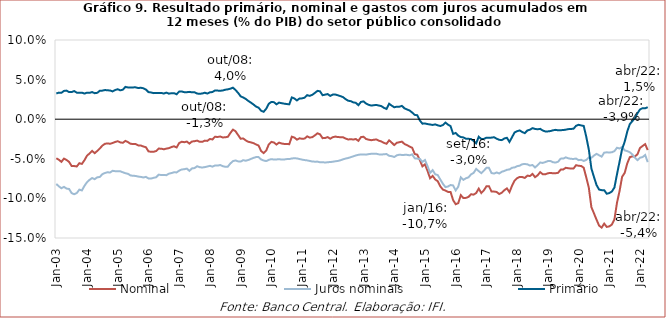
| Category | Nominal | Juros nominais | Primário |
|---|---|---|---|
| 2003-01-01 | -0.049 | -0.082 | 0.032 |
| 2003-02-01 | -0.051 | -0.085 | 0.034 |
| 2003-03-01 | -0.054 | -0.087 | 0.033 |
| 2003-04-01 | -0.05 | -0.085 | 0.036 |
| 2003-05-01 | -0.051 | -0.088 | 0.036 |
| 2003-06-01 | -0.054 | -0.088 | 0.034 |
| 2003-07-01 | -0.059 | -0.093 | 0.034 |
| 2003-08-01 | -0.059 | -0.095 | 0.036 |
| 2003-09-01 | -0.06 | -0.093 | 0.034 |
| 2003-10-01 | -0.056 | -0.089 | 0.033 |
| 2003-11-01 | -0.056 | -0.09 | 0.034 |
| 2003-12-01 | -0.052 | -0.084 | 0.032 |
| 2004-01-01 | -0.046 | -0.08 | 0.033 |
| 2004-02-01 | -0.043 | -0.077 | 0.033 |
| 2004-03-01 | -0.04 | -0.074 | 0.034 |
| 2004-04-01 | -0.043 | -0.076 | 0.033 |
| 2004-05-01 | -0.04 | -0.073 | 0.033 |
| 2004-06-01 | -0.037 | -0.073 | 0.036 |
| 2004-07-01 | -0.033 | -0.069 | 0.036 |
| 2004-08-01 | -0.031 | -0.068 | 0.037 |
| 2004-09-01 | -0.031 | -0.067 | 0.036 |
| 2004-10-01 | -0.031 | -0.067 | 0.036 |
| 2004-11-01 | -0.03 | -0.065 | 0.035 |
| 2004-12-01 | -0.029 | -0.066 | 0.037 |
| 2005-01-01 | -0.028 | -0.066 | 0.038 |
| 2005-02-01 | -0.029 | -0.066 | 0.036 |
| 2005-03-01 | -0.03 | -0.067 | 0.037 |
| 2005-04-01 | -0.027 | -0.068 | 0.041 |
| 2005-05-01 | -0.029 | -0.069 | 0.04 |
| 2005-06-01 | -0.031 | -0.071 | 0.04 |
| 2005-07-01 | -0.031 | -0.071 | 0.04 |
| 2005-08-01 | -0.031 | -0.072 | 0.04 |
| 2005-09-01 | -0.033 | -0.072 | 0.039 |
| 2005-10-01 | -0.033 | -0.073 | 0.04 |
| 2005-11-01 | -0.034 | -0.074 | 0.039 |
| 2005-12-01 | -0.035 | -0.073 | 0.037 |
| 2006-01-01 | -0.041 | -0.075 | 0.034 |
| 2006-02-01 | -0.041 | -0.075 | 0.034 |
| 2006-03-01 | -0.041 | -0.074 | 0.033 |
| 2006-04-01 | -0.04 | -0.073 | 0.033 |
| 2006-05-01 | -0.037 | -0.07 | 0.033 |
| 2006-06-01 | -0.037 | -0.07 | 0.033 |
| 2006-07-01 | -0.038 | -0.07 | 0.032 |
| 2006-08-01 | -0.037 | -0.071 | 0.034 |
| 2006-09-01 | -0.037 | -0.069 | 0.032 |
| 2006-10-01 | -0.035 | -0.068 | 0.033 |
| 2006-11-01 | -0.034 | -0.067 | 0.033 |
| 2006-12-01 | -0.036 | -0.067 | 0.032 |
| 2007-01-01 | -0.03 | -0.065 | 0.035 |
| 2007-02-01 | -0.028 | -0.063 | 0.035 |
| 2007-03-01 | -0.029 | -0.063 | 0.034 |
| 2007-04-01 | -0.028 | -0.062 | 0.034 |
| 2007-05-01 | -0.031 | -0.065 | 0.034 |
| 2007-06-01 | -0.028 | -0.062 | 0.034 |
| 2007-07-01 | -0.028 | -0.062 | 0.034 |
| 2007-08-01 | -0.027 | -0.059 | 0.032 |
| 2007-09-01 | -0.028 | -0.061 | 0.032 |
| 2007-10-01 | -0.029 | -0.061 | 0.032 |
| 2007-11-01 | -0.027 | -0.06 | 0.033 |
| 2007-12-01 | -0.027 | -0.06 | 0.032 |
| 2008-01-01 | -0.025 | -0.059 | 0.034 |
| 2008-02-01 | -0.026 | -0.06 | 0.034 |
| 2008-03-01 | -0.022 | -0.058 | 0.036 |
| 2008-04-01 | -0.022 | -0.059 | 0.036 |
| 2008-05-01 | -0.022 | -0.058 | 0.036 |
| 2008-06-01 | -0.023 | -0.059 | 0.036 |
| 2008-07-01 | -0.023 | -0.06 | 0.037 |
| 2008-08-01 | -0.022 | -0.06 | 0.038 |
| 2008-09-01 | -0.017 | -0.056 | 0.039 |
| 2008-10-01 | -0.013 | -0.053 | 0.04 |
| 2008-11-01 | -0.015 | -0.052 | 0.037 |
| 2008-12-01 | -0.02 | -0.053 | 0.033 |
| 2009-01-01 | -0.025 | -0.054 | 0.029 |
| 2009-02-01 | -0.024 | -0.052 | 0.027 |
| 2009-03-01 | -0.027 | -0.052 | 0.026 |
| 2009-04-01 | -0.029 | -0.052 | 0.023 |
| 2009-05-01 | -0.029 | -0.05 | 0.021 |
| 2009-06-01 | -0.03 | -0.049 | 0.019 |
| 2009-07-01 | -0.032 | -0.048 | 0.016 |
| 2009-08-01 | -0.033 | -0.048 | 0.015 |
| 2009-09-01 | -0.04 | -0.051 | 0.011 |
| 2009-10-01 | -0.043 | -0.052 | 0.009 |
| 2009-11-01 | -0.04 | -0.053 | 0.013 |
| 2009-12-01 | -0.032 | -0.051 | 0.019 |
| 2010-01-01 | -0.029 | -0.05 | 0.022 |
| 2010-02-01 | -0.029 | -0.051 | 0.022 |
| 2010-03-01 | -0.032 | -0.051 | 0.019 |
| 2010-04-01 | -0.03 | -0.051 | 0.021 |
| 2010-05-01 | -0.031 | -0.051 | 0.02 |
| 2010-06-01 | -0.031 | -0.051 | 0.02 |
| 2010-07-01 | -0.031 | -0.05 | 0.019 |
| 2010-08-01 | -0.032 | -0.05 | 0.019 |
| 2010-09-01 | -0.022 | -0.05 | 0.028 |
| 2010-10-01 | -0.023 | -0.049 | 0.026 |
| 2010-11-01 | -0.026 | -0.05 | 0.024 |
| 2010-12-01 | -0.024 | -0.05 | 0.026 |
| 2011-01-01 | -0.025 | -0.051 | 0.026 |
| 2011-02-01 | -0.024 | -0.052 | 0.027 |
| 2011-03-01 | -0.022 | -0.052 | 0.03 |
| 2011-04-01 | -0.023 | -0.053 | 0.029 |
| 2011-05-01 | -0.023 | -0.053 | 0.031 |
| 2011-06-01 | -0.02 | -0.054 | 0.033 |
| 2011-07-01 | -0.018 | -0.054 | 0.036 |
| 2011-08-01 | -0.019 | -0.054 | 0.035 |
| 2011-09-01 | -0.024 | -0.054 | 0.03 |
| 2011-10-01 | -0.024 | -0.055 | 0.031 |
| 2011-11-01 | -0.023 | -0.054 | 0.032 |
| 2011-12-01 | -0.025 | -0.054 | 0.029 |
| 2012-01-01 | -0.023 | -0.054 | 0.031 |
| 2012-02-01 | -0.022 | -0.053 | 0.031 |
| 2012-03-01 | -0.023 | -0.053 | 0.03 |
| 2012-04-01 | -0.023 | -0.052 | 0.029 |
| 2012-05-01 | -0.023 | -0.051 | 0.028 |
| 2012-06-01 | -0.024 | -0.05 | 0.025 |
| 2012-07-01 | -0.026 | -0.049 | 0.023 |
| 2012-08-01 | -0.025 | -0.048 | 0.023 |
| 2012-09-01 | -0.026 | -0.047 | 0.021 |
| 2012-10-01 | -0.025 | -0.046 | 0.021 |
| 2012-11-01 | -0.027 | -0.045 | 0.018 |
| 2012-12-01 | -0.023 | -0.044 | 0.022 |
| 2013-01-01 | -0.022 | -0.045 | 0.022 |
| 2013-02-01 | -0.025 | -0.045 | 0.02 |
| 2013-03-01 | -0.026 | -0.044 | 0.018 |
| 2013-04-01 | -0.026 | -0.044 | 0.017 |
| 2013-05-01 | -0.026 | -0.044 | 0.018 |
| 2013-06-01 | -0.026 | -0.044 | 0.018 |
| 2013-07-01 | -0.027 | -0.044 | 0.017 |
| 2013-08-01 | -0.028 | -0.045 | 0.016 |
| 2013-09-01 | -0.03 | -0.044 | 0.014 |
| 2013-10-01 | -0.031 | -0.044 | 0.013 |
| 2013-11-01 | -0.027 | -0.046 | 0.02 |
| 2013-12-01 | -0.03 | -0.047 | 0.017 |
| 2014-01-01 | -0.033 | -0.048 | 0.015 |
| 2014-02-01 | -0.03 | -0.046 | 0.016 |
| 2014-03-01 | -0.029 | -0.045 | 0.016 |
| 2014-04-01 | -0.028 | -0.045 | 0.017 |
| 2014-05-01 | -0.031 | -0.045 | 0.014 |
| 2014-06-01 | -0.033 | -0.045 | 0.012 |
| 2014-07-01 | -0.035 | -0.046 | 0.011 |
| 2014-08-01 | -0.036 | -0.044 | 0.008 |
| 2014-09-01 | -0.044 | -0.049 | 0.005 |
| 2014-10-01 | -0.045 | -0.05 | 0.005 |
| 2014-11-01 | -0.052 | -0.05 | -0.002 |
| 2014-12-01 | -0.06 | -0.054 | -0.006 |
| 2015-01-01 | -0.057 | -0.052 | -0.005 |
| 2015-02-01 | -0.065 | -0.059 | -0.006 |
| 2015-03-01 | -0.074 | -0.068 | -0.007 |
| 2015-04-01 | -0.072 | -0.064 | -0.007 |
| 2015-05-01 | -0.076 | -0.07 | -0.007 |
| 2015-06-01 | -0.078 | -0.071 | -0.008 |
| 2015-07-01 | -0.085 | -0.076 | -0.009 |
| 2015-08-01 | -0.089 | -0.081 | -0.007 |
| 2015-09-01 | -0.09 | -0.086 | -0.004 |
| 2015-10-01 | -0.092 | -0.085 | -0.007 |
| 2015-11-01 | -0.092 | -0.083 | -0.009 |
| 2015-12-01 | -0.102 | -0.084 | -0.019 |
| 2016-01-01 | -0.107 | -0.09 | -0.017 |
| 2016-02-01 | -0.106 | -0.085 | -0.021 |
| 2016-03-01 | -0.096 | -0.073 | -0.023 |
| 2016-04-01 | -0.1 | -0.077 | -0.023 |
| 2016-05-01 | -0.099 | -0.075 | -0.025 |
| 2016-06-01 | -0.098 | -0.073 | -0.025 |
| 2016-07-01 | -0.095 | -0.07 | -0.025 |
| 2016-08-01 | -0.095 | -0.068 | -0.027 |
| 2016-09-01 | -0.093 | -0.063 | -0.03 |
| 2016-10-01 | -0.088 | -0.066 | -0.022 |
| 2016-11-01 | -0.093 | -0.068 | -0.025 |
| 2016-12-01 | -0.09 | -0.065 | -0.025 |
| 2017-01-01 | -0.085 | -0.061 | -0.023 |
| 2017-02-01 | -0.085 | -0.061 | -0.023 |
| 2017-03-01 | -0.091 | -0.068 | -0.023 |
| 2017-04-01 | -0.091 | -0.069 | -0.023 |
| 2017-05-01 | -0.092 | -0.067 | -0.025 |
| 2017-06-01 | -0.095 | -0.069 | -0.026 |
| 2017-07-01 | -0.093 | -0.066 | -0.026 |
| 2017-08-01 | -0.09 | -0.065 | -0.024 |
| 2017-09-01 | -0.087 | -0.064 | -0.023 |
| 2017-10-01 | -0.092 | -0.063 | -0.029 |
| 2017-11-01 | -0.084 | -0.061 | -0.023 |
| 2017-12-01 | -0.078 | -0.061 | -0.017 |
| 2018-01-01 | -0.074 | -0.059 | -0.015 |
| 2018-02-01 | -0.073 | -0.059 | -0.014 |
| 2018-03-01 | -0.073 | -0.057 | -0.016 |
| 2018-04-01 | -0.074 | -0.057 | -0.018 |
| 2018-05-01 | -0.071 | -0.057 | -0.014 |
| 2018-06-01 | -0.072 | -0.059 | -0.013 |
| 2018-07-01 | -0.069 | -0.058 | -0.011 |
| 2018-08-01 | -0.073 | -0.061 | -0.012 |
| 2018-09-01 | -0.071 | -0.058 | -0.013 |
| 2018-10-01 | -0.067 | -0.055 | -0.012 |
| 2018-11-01 | -0.069 | -0.055 | -0.014 |
| 2018-12-01 | -0.07 | -0.054 | -0.015 |
| 2019-01-01 | -0.068 | -0.053 | -0.015 |
| 2019-02-01 | -0.068 | -0.053 | -0.015 |
| 2019-03-01 | -0.068 | -0.054 | -0.014 |
| 2019-04-01 | -0.068 | -0.055 | -0.013 |
| 2019-05-01 | -0.068 | -0.054 | -0.014 |
| 2019-06-01 | -0.064 | -0.05 | -0.014 |
| 2019-07-01 | -0.063 | -0.05 | -0.014 |
| 2019-08-01 | -0.061 | -0.048 | -0.013 |
| 2019-09-01 | -0.062 | -0.049 | -0.013 |
| 2019-10-01 | -0.062 | -0.05 | -0.012 |
| 2019-11-01 | -0.062 | -0.05 | -0.012 |
| 2019-12-01 | -0.058 | -0.05 | -0.008 |
| 2020-01-01 | -0.059 | -0.052 | -0.007 |
| 2020-02-01 | -0.059 | -0.051 | -0.008 |
| 2020-03-01 | -0.061 | -0.053 | -0.008 |
| 2020-04-01 | -0.074 | -0.051 | -0.022 |
| 2020-05-01 | -0.087 | -0.048 | -0.038 |
| 2020-06-01 | -0.111 | -0.049 | -0.062 |
| 2020-07-01 | -0.119 | -0.046 | -0.073 |
| 2020-08-01 | -0.127 | -0.044 | -0.083 |
| 2020-09-01 | -0.134 | -0.046 | -0.089 |
| 2020-10-01 | -0.137 | -0.047 | -0.09 |
| 2020-11-01 | -0.132 | -0.042 | -0.09 |
| 2020-12-01 | -0.136 | -0.042 | -0.094 |
| 2021-01-01 | -0.135 | -0.042 | -0.093 |
| 2021-02-01 | -0.133 | -0.042 | -0.091 |
| 2021-03-01 | -0.127 | -0.04 | -0.086 |
| 2021-04-01 | -0.105 | -0.036 | -0.069 |
| 2021-05-01 | -0.091 | -0.037 | -0.054 |
| 2021-06-01 | -0.073 | -0.035 | -0.038 |
| 2021-07-01 | -0.068 | -0.039 | -0.029 |
| 2021-08-01 | -0.056 | -0.04 | -0.016 |
| 2021-09-01 | -0.048 | -0.042 | -0.006 |
| 2021-10-01 | -0.047 | -0.044 | -0.002 |
| 2021-11-01 | -0.047 | -0.049 | 0.001 |
| 2021-12-01 | -0.044 | -0.052 | 0.007 |
| 2022-01-01 | -0.036 | -0.049 | 0.012 |
| 2022-02-01 | -0.034 | -0.048 | 0.014 |
| 2022-03-01 | -0.031 | -0.045 | 0.014 |
| 2022-04-01 | -0.039 | -0.054 | 0.015 |